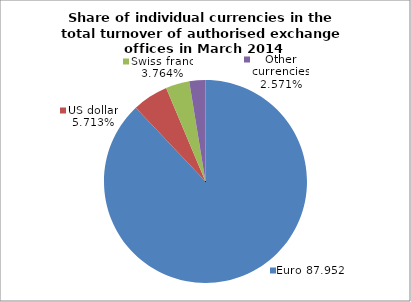
| Category | EUR |
|---|---|
| 0 | 0.88 |
| 1 | 0.057 |
| 2 | 0.038 |
| 3 | 0.026 |